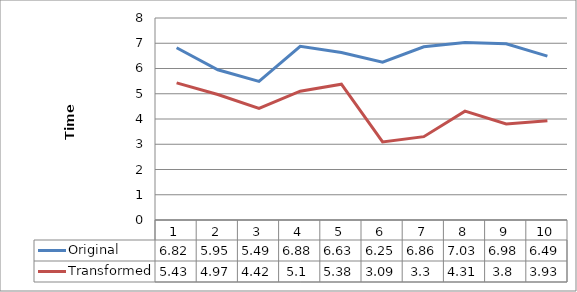
| Category | Original | Transformed |
|---|---|---|
| 0 | 6.82 | 5.43 |
| 1 | 5.95 | 4.97 |
| 2 | 5.49 | 4.42 |
| 3 | 6.88 | 5.1 |
| 4 | 6.63 | 5.38 |
| 5 | 6.25 | 3.09 |
| 6 | 6.86 | 3.3 |
| 7 | 7.03 | 4.31 |
| 8 | 6.98 | 3.8 |
| 9 | 6.49 | 3.93 |